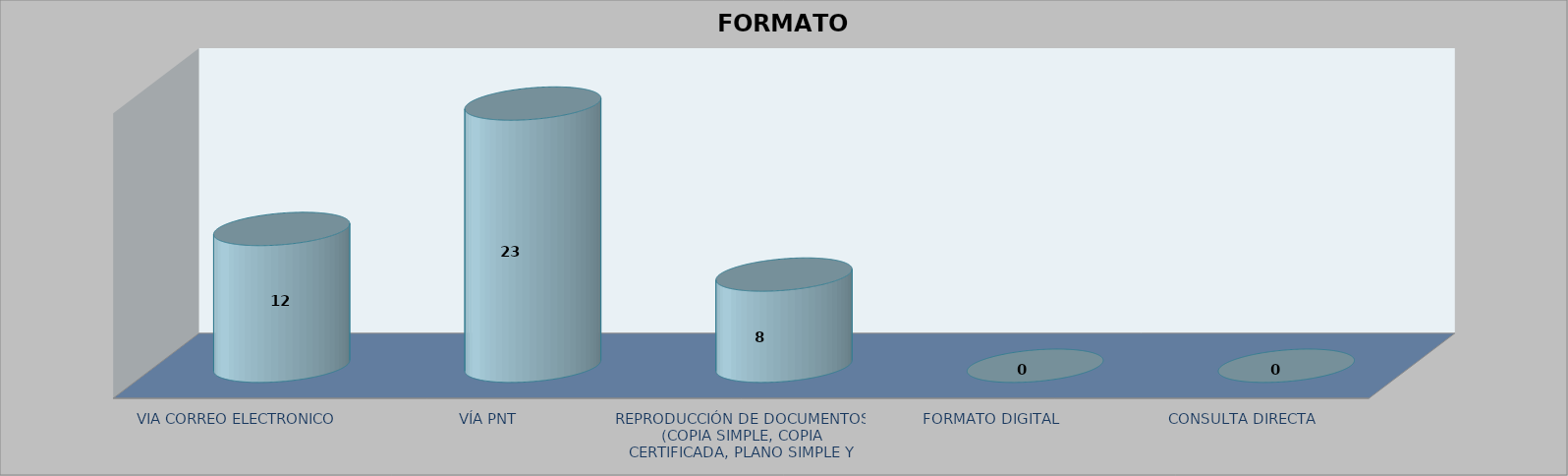
| Category |        FORMATO SOLICITADO | Series 1 | Series 2 |
|---|---|---|---|
| VIA CORREO ELECTRONICO |  |  | 12 |
| VÍA PNT |  |  | 23 |
| REPRODUCCIÓN DE DOCUMENTOS (COPIA SIMPLE, COPIA CERTIFICADA, PLANO SIMPLE Y PLANO CERTIFICADO) |  |  | 8 |
| FORMATO DIGITAL |  |  | 0 |
| CONSULTA DIRECTA |  |  | 0 |